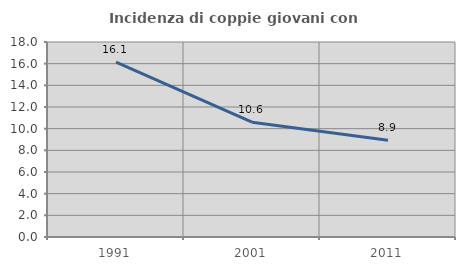
| Category | Incidenza di coppie giovani con figli |
|---|---|
| 1991.0 | 16.138 |
| 2001.0 | 10.597 |
| 2011.0 | 8.934 |